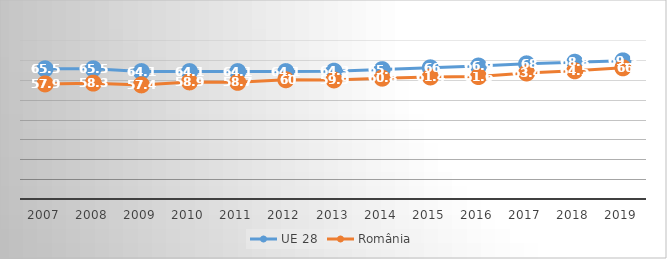
| Category | UE 28 | România |
|---|---|---|
| 2007.0 | 65.5 | 57.9 |
| 2008.0 | 65.5 | 58.3 |
| 2009.0 | 64.1 | 57.4 |
| 2010.0 | 64.1 | 58.9 |
| 2011.0 | 64.1 | 58.7 |
| 2012.0 | 64.1 | 60 |
| 2013.0 | 64.3 | 59.9 |
| 2014.0 | 65.1 | 60.8 |
| 2015.0 | 66 | 61.4 |
| 2016.0 | 66.9 | 61.6 |
| 2017.0 | 68 | 63.4 |
| 2018.0 | 68.8 | 64.5 |
| 2019.0 | 69.5 | 66 |